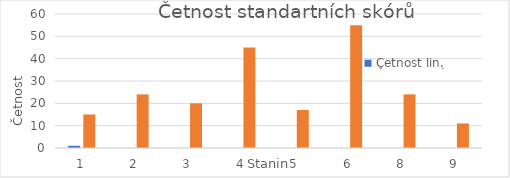
| Category | Četnost lin. | Četnost nelin. |
|---|---|---|
| 1.0 | 1 | 15 |
| 2.0 | 0 | 24 |
| 3.0 | 0 | 20 |
| 4.0 | 0 | 45 |
| 5.0 | 0 | 17 |
| 6.0 | 0 | 55 |
| 8.0 | 0 | 24 |
| 9.0 | 0 | 11 |